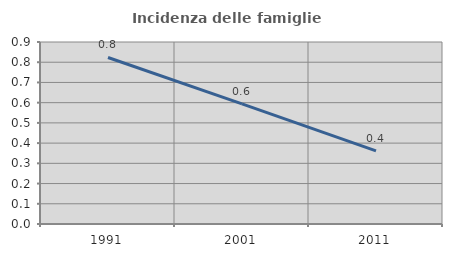
| Category | Incidenza delle famiglie numerose |
|---|---|
| 1991.0 | 0.824 |
| 2001.0 | 0.594 |
| 2011.0 | 0.362 |